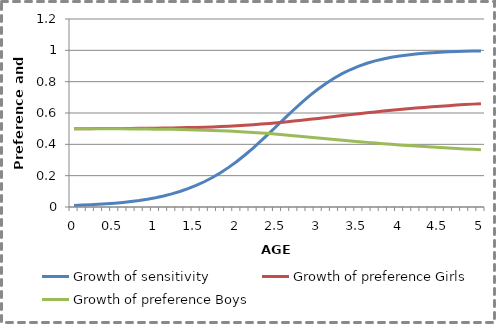
| Category | Growth of sensitivity | Growth of preference Girls | Growth of preference Boys |
|---|---|---|---|
| 0.0 | 0.01 | 0.5 | 0.5 |
| 0.1 | 0.012 | 0.5 | 0.5 |
| 0.2 | 0.014 | 0.5 | 0.5 |
| 0.3 | 0.017 | 0.5 | 0.5 |
| 0.4 | 0.021 | 0.501 | 0.499 |
| 0.5 | 0.025 | 0.501 | 0.499 |
| 0.6 | 0.029 | 0.501 | 0.499 |
| 0.7 | 0.035 | 0.502 | 0.498 |
| 0.8 | 0.042 | 0.502 | 0.498 |
| 0.9 | 0.05 | 0.502 | 0.498 |
| 1.0 | 0.059 | 0.503 | 0.497 |
| 1.1 | 0.07 | 0.504 | 0.496 |
| 1.2 | 0.084 | 0.505 | 0.495 |
| 1.3 | 0.099 | 0.506 | 0.495 |
| 1.4 | 0.117 | 0.507 | 0.493 |
| 1.5 | 0.137 | 0.508 | 0.492 |
| 1.6 | 0.161 | 0.51 | 0.491 |
| 1.7 | 0.188 | 0.511 | 0.489 |
| 1.8 | 0.219 | 0.514 | 0.487 |
| 1.9 | 0.253 | 0.516 | 0.484 |
| 2.0 | 0.291 | 0.519 | 0.482 |
| 2.1 | 0.332 | 0.522 | 0.479 |
| 2.2 | 0.376 | 0.525 | 0.476 |
| 2.3 | 0.423 | 0.529 | 0.472 |
| 2.4 | 0.472 | 0.533 | 0.468 |
| 2.5 | 0.522 | 0.538 | 0.464 |
| 2.6 | 0.572 | 0.543 | 0.46 |
| 2.7 | 0.621 | 0.548 | 0.455 |
| 2.8 | 0.668 | 0.554 | 0.451 |
| 2.9 | 0.712 | 0.56 | 0.446 |
| 3.0 | 0.753 | 0.566 | 0.441 |
| 3.1 | 0.79 | 0.572 | 0.436 |
| 3.2 | 0.823 | 0.578 | 0.431 |
| 3.3 | 0.853 | 0.584 | 0.426 |
| 3.4 | 0.878 | 0.59 | 0.422 |
| 3.5 | 0.899 | 0.595 | 0.417 |
| 3.6 | 0.917 | 0.601 | 0.412 |
| 3.7 | 0.932 | 0.607 | 0.408 |
| 3.8 | 0.945 | 0.612 | 0.404 |
| 3.9 | 0.955 | 0.617 | 0.4 |
| 4.0 | 0.964 | 0.622 | 0.396 |
| 4.1 | 0.971 | 0.627 | 0.392 |
| 4.2 | 0.977 | 0.631 | 0.389 |
| 4.3 | 0.981 | 0.636 | 0.385 |
| 4.4 | 0.985 | 0.64 | 0.382 |
| 4.5 | 0.988 | 0.643 | 0.379 |
| 4.6 | 0.99 | 0.647 | 0.376 |
| 4.7 | 0.992 | 0.65 | 0.373 |
| 4.8 | 0.994 | 0.654 | 0.371 |
| 4.9 | 0.995 | 0.657 | 0.368 |
| 5.0 | 0.996 | 0.659 | 0.366 |